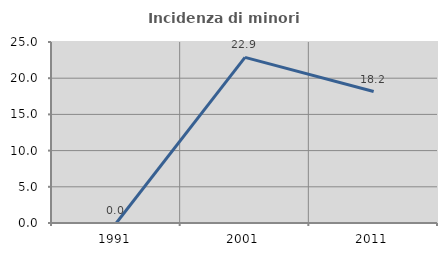
| Category | Incidenza di minori stranieri |
|---|---|
| 1991.0 | 0 |
| 2001.0 | 22.881 |
| 2011.0 | 18.158 |